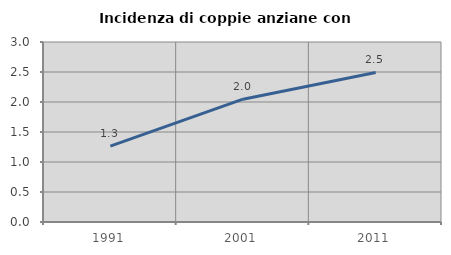
| Category | Incidenza di coppie anziane con figli |
|---|---|
| 1991.0 | 1.266 |
| 2001.0 | 2.047 |
| 2011.0 | 2.493 |